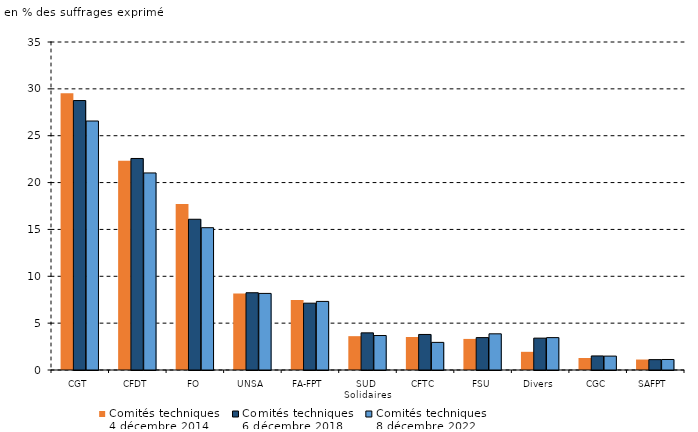
| Category | Comités techniques
4 décembre 2014 | Comités techniques
6 décembre 2018 | Comités techniques
8 décembre 2022 |
|---|---|---|---|
| 0 | 29.532 | 28.753 | 26.569 |
| 1 | 22.332 | 22.57 | 21.027 |
| 2 | 17.714 | 16.085 | 15.185 |
| 3 | 8.165 | 8.244 | 8.173 |
| 4 | 7.471 | 7.13 | 7.318 |
| 5 | 3.611 | 3.964 | 3.678 |
| 6 | 3.519 | 3.792 | 2.947 |
| 7 | 3.317 | 3.457 | 3.861 |
| 8 | 1.94 | 3.4 | 3.456 |
| 9 | 1.283 | 1.499 | 1.482 |
| 10 | 1.117 | 1.107 | 1.122 |